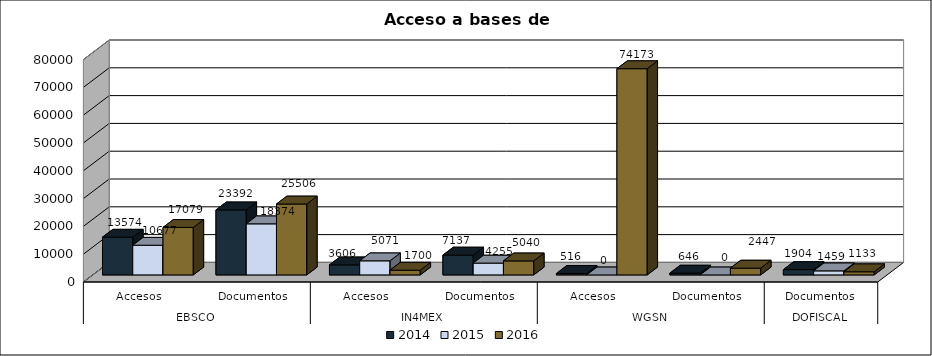
| Category | 2014 | 2015 | 2016 |
|---|---|---|---|
| 0 | 13574 | 10677 | 17079 |
| 1 | 23392 | 18374 | 25506 |
| 2 | 3606 | 5071 | 1700 |
| 3 | 7137 | 4255 | 5040 |
| 4 | 516 | 0 | 74173 |
| 5 | 646 | 0 | 2447 |
| 6 | 1904 | 1459 | 1133 |